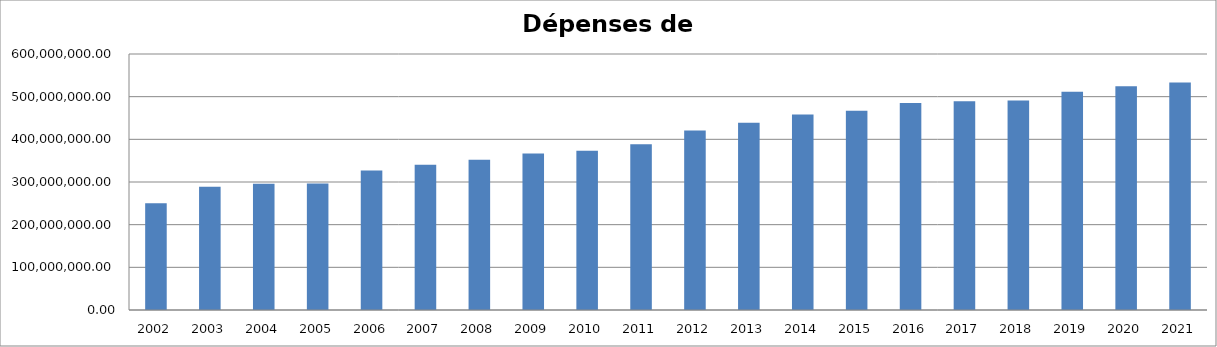
| Category | Series 0 |
|---|---|
| 2002.0 | 250089526.67 |
| 2003.0 | 288903804.01 |
| 2004.0 | 295771671.02 |
| 2005.0 | 296518465.51 |
| 2006.0 | 327168376.76 |
| 2007.0 | 340707596.72 |
| 2008.0 | 351971080.51 |
| 2009.0 | 366911426.93 |
| 2010.0 | 373378673.93 |
| 2011.0 | 388637923.02 |
| 2012.0 | 420462295.46 |
| 2013.0 | 438892503.06 |
| 2014.0 | 458203591.26 |
| 2015.0 | 467261871.94 |
| 2016.0 | 484916720.94 |
| 2017.0 | 489421974.61 |
| 2018.0 | 491116662.46 |
| 2019.0 | 511592901.04 |
| 2020.0 | 524500869.6 |
| 2021.0 | 533379783.8 |